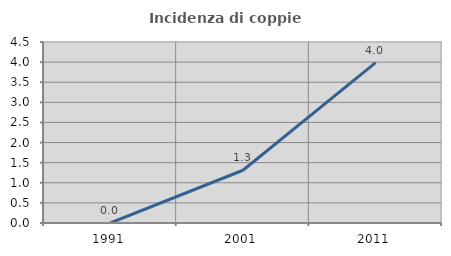
| Category | Incidenza di coppie miste |
|---|---|
| 1991.0 | 0 |
| 2001.0 | 1.311 |
| 2011.0 | 3.987 |